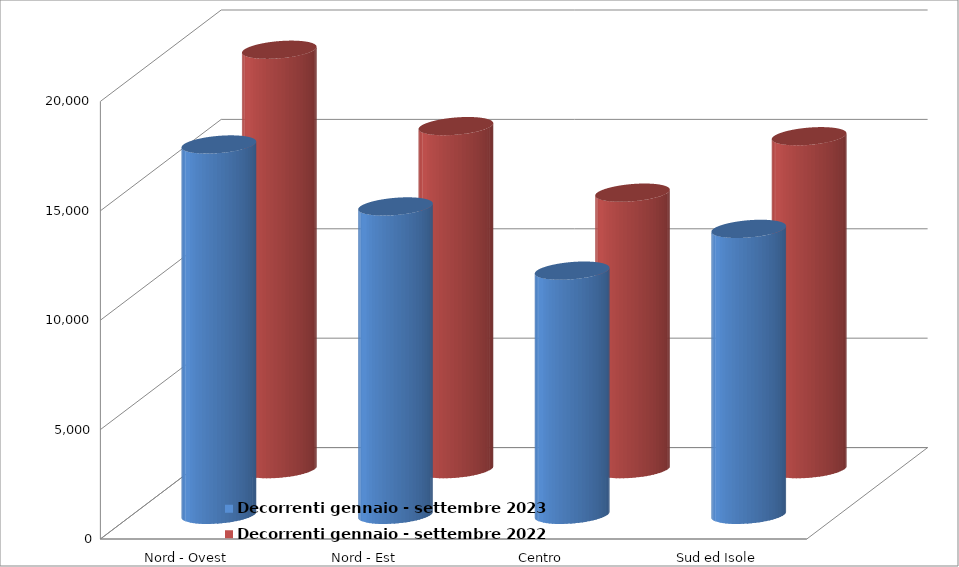
| Category | Decorrenti gennaio - settembre 2023 | Decorrenti gennaio - settembre 2022 |
|---|---|---|
| Nord - Ovest | 16928 | 19169 |
| Nord - Est | 14096 | 15678 |
| Centro | 11162 | 12637 |
| Sud ed Isole | 13071 | 15216 |